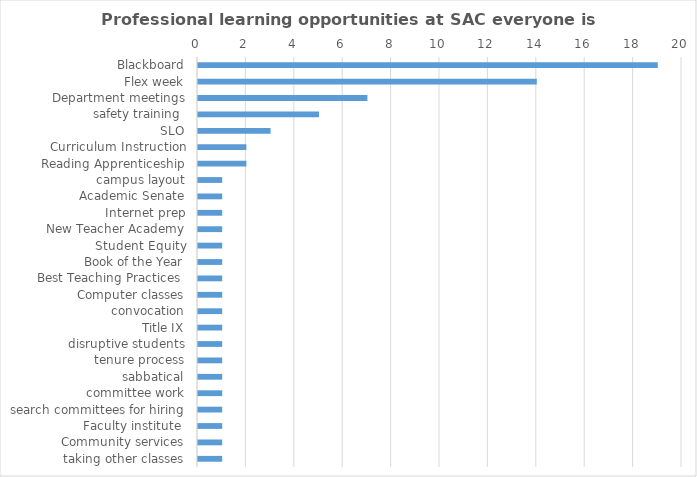
| Category | Series 0 |
|---|---|
| Blackboard | 19 |
| Flex week | 14 |
| Department meetings | 7 |
| safety training  | 5 |
| SLO | 3 |
| Curriculum Instruction | 2 |
| Reading Apprenticeship | 2 |
| campus layout | 1 |
| Academic Senate | 1 |
| Internet prep | 1 |
| New Teacher Academy | 1 |
| Student Equity | 1 |
| Book of the Year | 1 |
| Best Teaching Practices  | 1 |
| Computer classes | 1 |
| convocation | 1 |
| Title IX | 1 |
| disruptive students | 1 |
| tenure process | 1 |
| sabbatical | 1 |
| committee work | 1 |
| search committees for hiring | 1 |
| Faculty institute  | 1 |
| Community services | 1 |
| taking other classes | 1 |